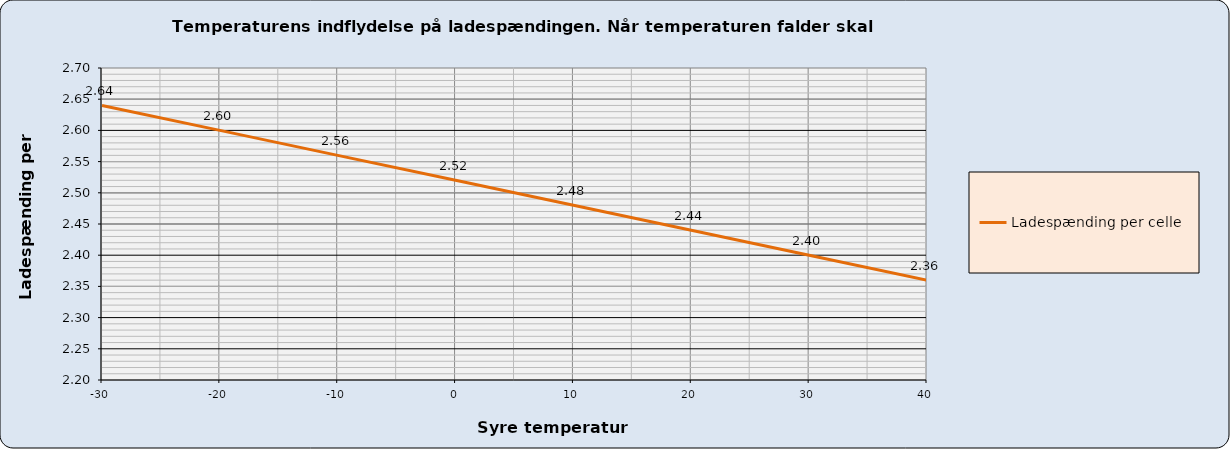
| Category | Ladespænding per celle |
|---|---|
| -30.0 | 2.64 |
| -20.0 | 2.6 |
| -10.0 | 2.56 |
| 0.0 | 2.52 |
| 10.0 | 2.48 |
| 20.0 | 2.44 |
| 30.0 | 2.4 |
| 40.0 | 2.36 |